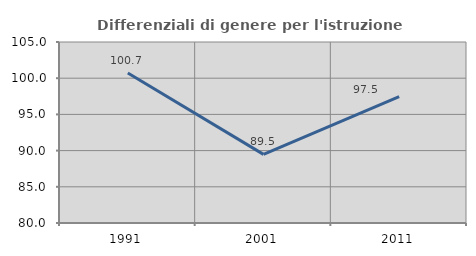
| Category | Differenziali di genere per l'istruzione superiore |
|---|---|
| 1991.0 | 100.716 |
| 2001.0 | 89.48 |
| 2011.0 | 97.45 |